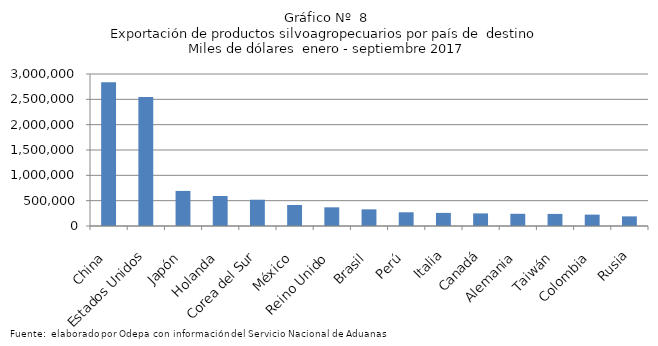
| Category | Series 0 |
|---|---|
| China | 2835764.333 |
| Estados Unidos | 2546754.066 |
| Japón | 692342.007 |
| Holanda | 592146.426 |
| Corea del Sur | 518598.277 |
| México | 414670.109 |
| Reino Unido | 368482.118 |
| Brasil | 328418.758 |
| Perú | 270664.404 |
| Italia | 258636.975 |
| Canadá | 248437.246 |
| Alemania | 240946.209 |
| Taiwán | 238582.174 |
| Colombia | 224713.083 |
| Rusia | 190014.059 |